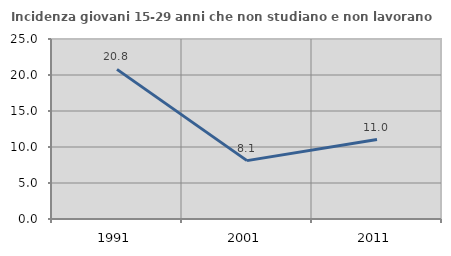
| Category | Incidenza giovani 15-29 anni che non studiano e non lavorano  |
|---|---|
| 1991.0 | 20.779 |
| 2001.0 | 8.108 |
| 2011.0 | 11.037 |